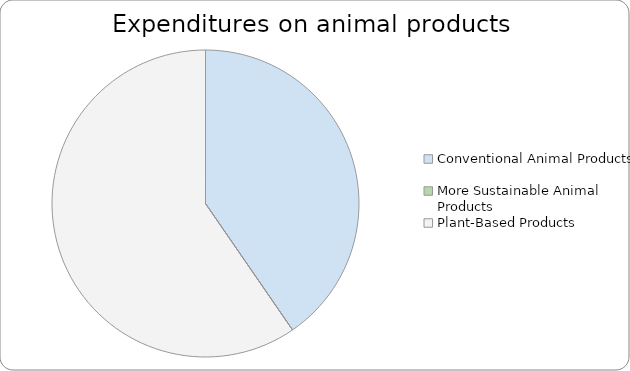
| Category | Series 0 |
|---|---|
| Conventional Animal Products | 0.404 |
| More Sustainable Animal Products | 0 |
| Plant-Based Products | 0.596 |